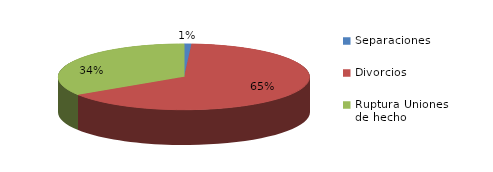
| Category | Series 0 |
|---|---|
| Separaciones | 2 |
| Divorcios | 137 |
| Ruptura Uniones de hecho | 72 |